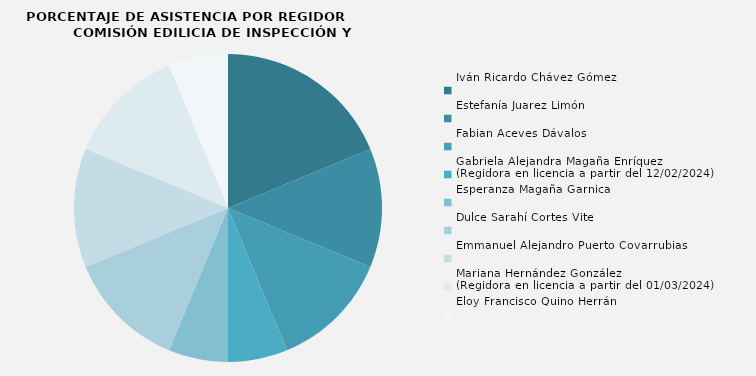
| Category | Iván Ricardo Chávez Gómez  |
|---|---|
| Iván Ricardo Chávez Gómez  | 100 |
| Estefanía Juarez Limón | 66.667 |
| Fabian Aceves Dávalos | 66.667 |
| Gabriela Alejandra Magaña Enríquez
(Regidora en licencia a partir del 12/02/2024) | 33.333 |
| Esperanza Magaña Garnica  | 33.333 |
| Dulce Sarahí Cortes Vite | 66.667 |
| Emmanuel Alejandro Puerto Covarrubias | 66.667 |
| Mariana Hernández González
(Regidora en licencia a partir del 01/03/2024) | 66.667 |
| Eloy Francisco Quino Herrán | 33.333 |